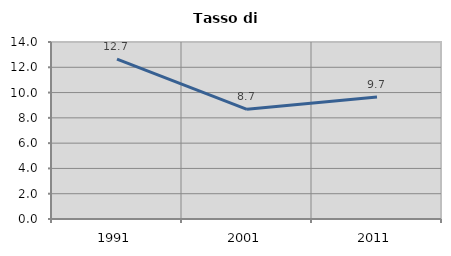
| Category | Tasso di disoccupazione   |
|---|---|
| 1991.0 | 12.653 |
| 2001.0 | 8.677 |
| 2011.0 | 9.656 |